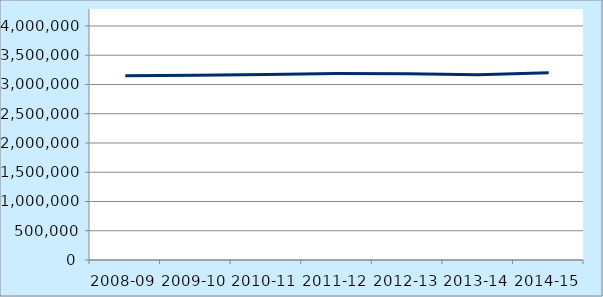
| Category | List size |
|---|---|
| 2008-09 | 3147550 |
| 2009-10 | 3155692 |
| 2010-11 | 3168721 |
| 2011-12 | 3185538 |
| 2012-13 | 3184260 |
| 2013-14 | 3165517 |
| 2014-15 | 3201691 |